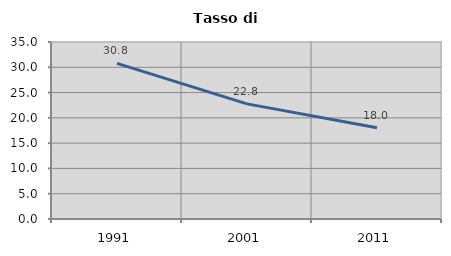
| Category | Tasso di disoccupazione   |
|---|---|
| 1991.0 | 30.761 |
| 2001.0 | 22.766 |
| 2011.0 | 18.024 |